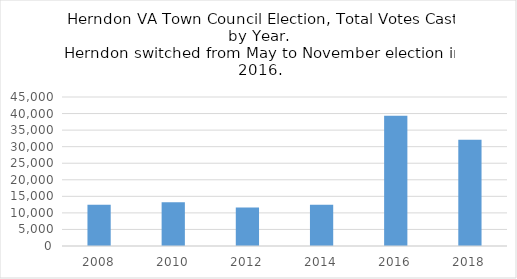
| Category | Series 0 |
|---|---|
| 2008.0 | 12460 |
| 2010.0 | 13194 |
| 2012.0 | 11610 |
| 2014.0 | 12434 |
| 2016.0 | 39332 |
| 2018.0 | 32059 |